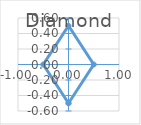
| Category | Diamond |
|---|---|
| 0.0 | -0.5 |
| 0.5 | 0 |
| 0.0 | 0.5 |
| -0.5 | 0 |
| 0.0 | -0.5 |